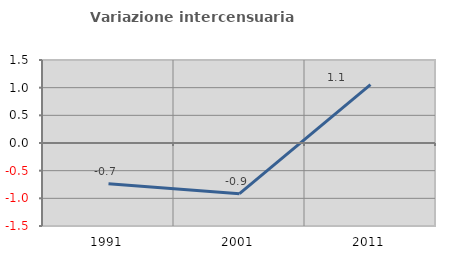
| Category | Variazione intercensuaria annua |
|---|---|
| 1991.0 | -0.736 |
| 2001.0 | -0.916 |
| 2011.0 | 1.056 |